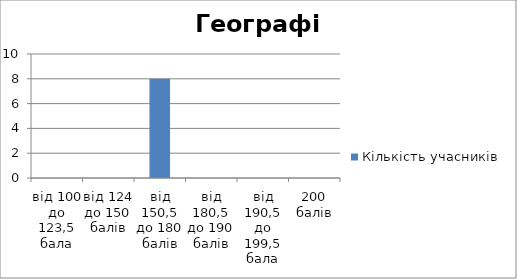
| Category | Кількість учасників |
|---|---|
| від 100 до 123,5 бала | 0 |
| від 124 до 150 балів | 0 |
| від 150,5 до 180 балів | 8 |
| від 180,5 до 190 балів | 0 |
| від 190,5 до 199,5 бала | 0 |
| 200 балів | 0 |